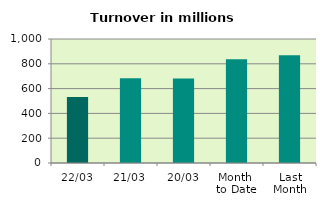
| Category | Series 0 |
|---|---|
| 22/03 | 531.361 |
| 21/03 | 682.794 |
| 20/03 | 681.148 |
| Month 
to Date | 836.851 |
| Last
Month | 868.35 |